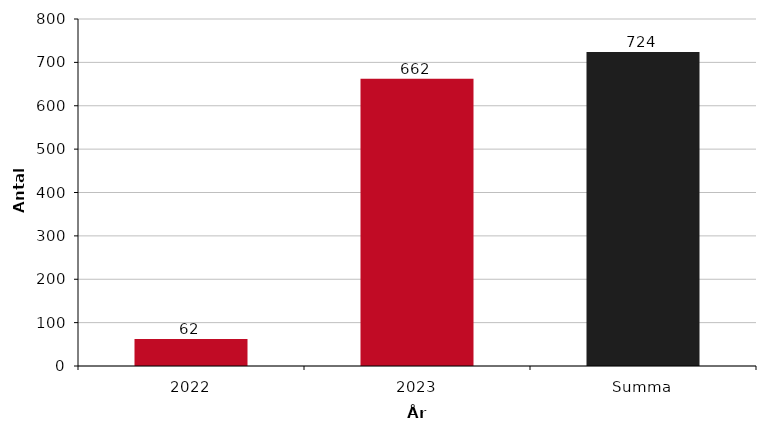
| Category | Antal klimatdeklarationer |
|---|---|
| 2022 | 62 |
| 2023 | 662 |
| Summa | 724 |